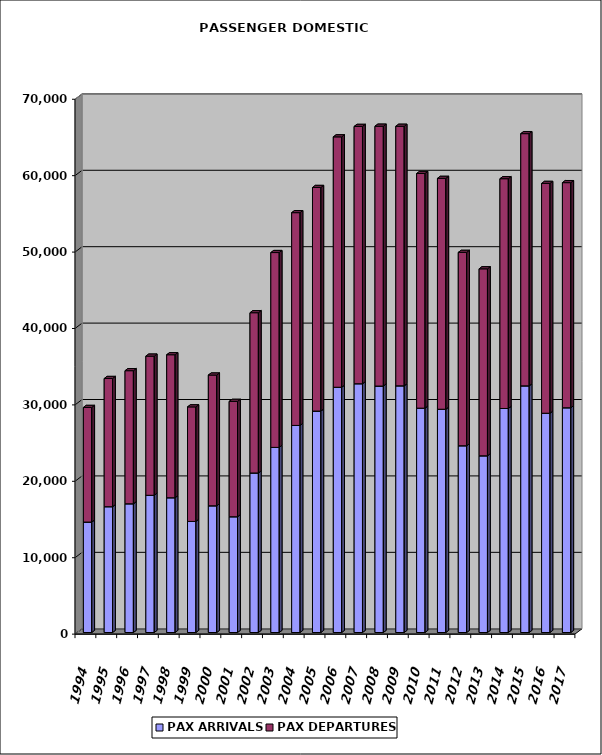
| Category | PAX ARRIVALS | PAX DEPARTURES |
|---|---|---|
| 1994.0 | 14456 | 14998 |
| 1995.0 | 16466 | 16777 |
| 1996.0 | 16848 | 17417 |
| 1997.0 | 17959 | 18207 |
| 1998.0 | 17637 | 18716 |
| 1999.0 | 14541 | 14986 |
| 2000.0 | 16585 | 17107 |
| 2001.0 | 15151 | 15095 |
| 2002.0 | 20881 | 20971 |
| 2003.0 | 24229 | 25498 |
| 2004.0 | 27102 | 27844 |
| 2005.0 | 28983 | 29258 |
| 2006.0 | 32099 | 32767 |
| 2007.0 | 32560 | 33673 |
| 2008.0 | 32257 | 34003 |
| 2009.0 | 32285 | 33964 |
| 2010.0 | 29363 | 30709 |
| 2011.0 | 29222 | 30210 |
| 2012.0 | 24442 | 25304 |
| 2013.0 | 23126 | 24469 |
| 2014.0 | 29318 | 30072 |
| 2015.0 | 32281 | 33007 |
| 2016.0 | 28699 | 30073 |
| 2017.0 | 29414 | 29461 |